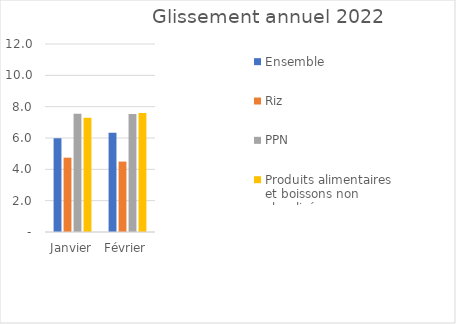
| Category |  Ensemble  |  Riz  |  PPN  |  Produits alimentaires et boissons non alcoolisés  |
|---|---|---|---|---|
| Janvier | 5.984 | 4.745 | 7.54 | 7.297 |
| Février | 6.337 | 4.495 | 7.537 | 7.591 |